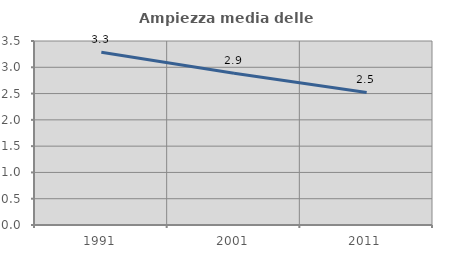
| Category | Ampiezza media delle famiglie |
|---|---|
| 1991.0 | 3.287 |
| 2001.0 | 2.886 |
| 2011.0 | 2.521 |